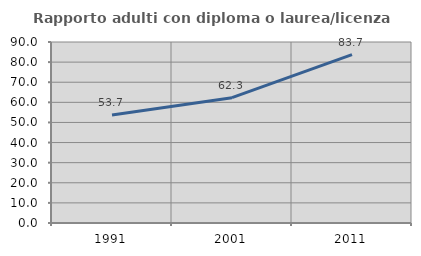
| Category | Rapporto adulti con diploma o laurea/licenza media  |
|---|---|
| 1991.0 | 53.686 |
| 2001.0 | 62.31 |
| 2011.0 | 83.733 |